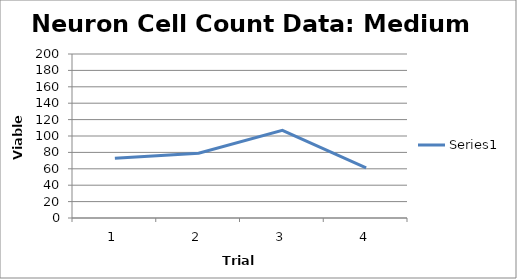
| Category | Series 0 |
|---|---|
| 0 | 73 |
| 1 | 79 |
| 2 | 107 |
| 3 | 61 |